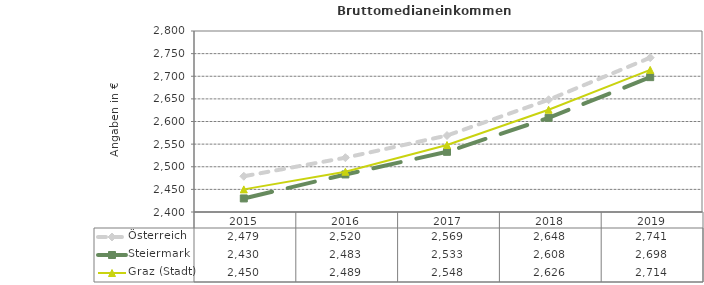
| Category | Österreich | Steiermark | Graz (Stadt) |
|---|---|---|---|
| 2019.0 | 2741 | 2698 | 2714 |
| 2018.0 | 2648 | 2608 | 2626 |
| 2017.0 | 2569 | 2533 | 2548 |
| 2016.0 | 2520 | 2483 | 2489 |
| 2015.0 | 2479 | 2430 | 2450 |